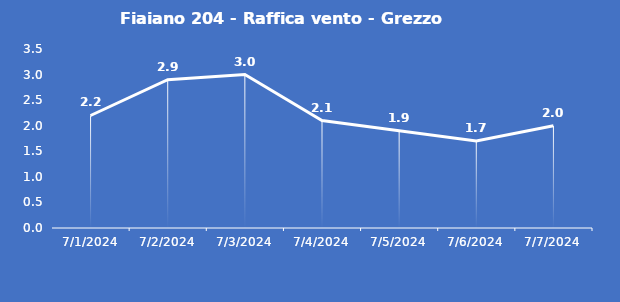
| Category | Fiaiano 204 - Raffica vento - Grezzo (m/s) |
|---|---|
| 7/1/24 | 2.2 |
| 7/2/24 | 2.9 |
| 7/3/24 | 3 |
| 7/4/24 | 2.1 |
| 7/5/24 | 1.9 |
| 7/6/24 | 1.7 |
| 7/7/24 | 2 |